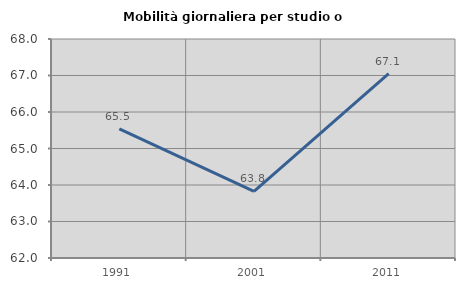
| Category | Mobilità giornaliera per studio o lavoro |
|---|---|
| 1991.0 | 65.54 |
| 2001.0 | 63.823 |
| 2011.0 | 67.051 |